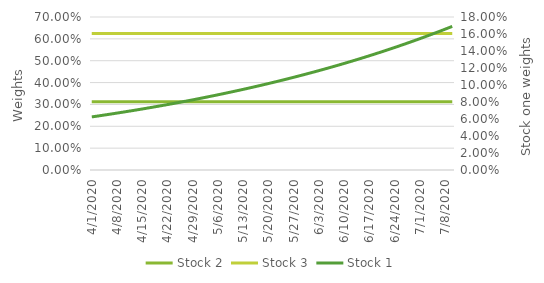
| Category | Stock 2 | Stock 3 |
|---|---|---|
| 4/1/20 | 0.312 | 0.625 |
| 4/2/20 | 0.312 | 0.625 |
| 4/3/20 | 0.312 | 0.625 |
| 4/4/20 | 0.312 | 0.625 |
| 4/5/20 | 0.312 | 0.625 |
| 4/6/20 | 0.312 | 0.625 |
| 4/7/20 | 0.312 | 0.625 |
| 4/8/20 | 0.312 | 0.625 |
| 4/9/20 | 0.312 | 0.625 |
| 4/10/20 | 0.312 | 0.625 |
| 4/11/20 | 0.312 | 0.625 |
| 4/12/20 | 0.312 | 0.625 |
| 4/13/20 | 0.312 | 0.625 |
| 4/14/20 | 0.312 | 0.625 |
| 4/15/20 | 0.312 | 0.625 |
| 4/16/20 | 0.312 | 0.625 |
| 4/17/20 | 0.312 | 0.625 |
| 4/18/20 | 0.312 | 0.625 |
| 4/19/20 | 0.312 | 0.625 |
| 4/20/20 | 0.312 | 0.625 |
| 4/21/20 | 0.312 | 0.625 |
| 4/22/20 | 0.312 | 0.625 |
| 4/23/20 | 0.312 | 0.625 |
| 4/24/20 | 0.312 | 0.625 |
| 4/25/20 | 0.312 | 0.625 |
| 4/26/20 | 0.312 | 0.625 |
| 4/27/20 | 0.312 | 0.625 |
| 4/28/20 | 0.312 | 0.625 |
| 4/29/20 | 0.312 | 0.625 |
| 4/30/20 | 0.312 | 0.625 |
| 5/1/20 | 0.312 | 0.625 |
| 5/2/20 | 0.312 | 0.625 |
| 5/3/20 | 0.312 | 0.625 |
| 5/4/20 | 0.312 | 0.625 |
| 5/5/20 | 0.312 | 0.625 |
| 5/6/20 | 0.312 | 0.625 |
| 5/7/20 | 0.312 | 0.625 |
| 5/8/20 | 0.312 | 0.625 |
| 5/9/20 | 0.312 | 0.625 |
| 5/10/20 | 0.312 | 0.625 |
| 5/11/20 | 0.312 | 0.625 |
| 5/12/20 | 0.312 | 0.625 |
| 5/13/20 | 0.312 | 0.625 |
| 5/14/20 | 0.312 | 0.625 |
| 5/15/20 | 0.312 | 0.625 |
| 5/16/20 | 0.312 | 0.625 |
| 5/17/20 | 0.312 | 0.625 |
| 5/18/20 | 0.312 | 0.625 |
| 5/19/20 | 0.312 | 0.625 |
| 5/20/20 | 0.312 | 0.625 |
| 5/21/20 | 0.312 | 0.625 |
| 5/22/20 | 0.312 | 0.625 |
| 5/23/20 | 0.312 | 0.625 |
| 5/24/20 | 0.312 | 0.625 |
| 5/25/20 | 0.312 | 0.625 |
| 5/26/20 | 0.312 | 0.625 |
| 5/27/20 | 0.312 | 0.625 |
| 5/28/20 | 0.312 | 0.625 |
| 5/29/20 | 0.312 | 0.625 |
| 5/30/20 | 0.312 | 0.625 |
| 5/31/20 | 0.312 | 0.625 |
| 6/1/20 | 0.312 | 0.625 |
| 6/2/20 | 0.312 | 0.625 |
| 6/3/20 | 0.312 | 0.625 |
| 6/4/20 | 0.312 | 0.625 |
| 6/5/20 | 0.312 | 0.625 |
| 6/6/20 | 0.312 | 0.625 |
| 6/7/20 | 0.312 | 0.625 |
| 6/8/20 | 0.312 | 0.625 |
| 6/9/20 | 0.312 | 0.625 |
| 6/10/20 | 0.312 | 0.625 |
| 6/11/20 | 0.312 | 0.625 |
| 6/12/20 | 0.312 | 0.625 |
| 6/13/20 | 0.312 | 0.625 |
| 6/14/20 | 0.312 | 0.625 |
| 6/15/20 | 0.312 | 0.625 |
| 6/16/20 | 0.312 | 0.625 |
| 6/17/20 | 0.312 | 0.625 |
| 6/18/20 | 0.312 | 0.625 |
| 6/19/20 | 0.312 | 0.625 |
| 6/20/20 | 0.312 | 0.625 |
| 6/21/20 | 0.312 | 0.625 |
| 6/22/20 | 0.312 | 0.625 |
| 6/23/20 | 0.312 | 0.625 |
| 6/24/20 | 0.312 | 0.625 |
| 6/25/20 | 0.312 | 0.625 |
| 6/26/20 | 0.312 | 0.625 |
| 6/27/20 | 0.312 | 0.625 |
| 6/28/20 | 0.312 | 0.625 |
| 6/29/20 | 0.312 | 0.625 |
| 6/30/20 | 0.312 | 0.625 |
| 7/1/20 | 0.312 | 0.625 |
| 7/2/20 | 0.312 | 0.625 |
| 7/3/20 | 0.312 | 0.625 |
| 7/4/20 | 0.312 | 0.625 |
| 7/5/20 | 0.312 | 0.625 |
| 7/6/20 | 0.312 | 0.625 |
| 7/7/20 | 0.312 | 0.625 |
| 7/8/20 | 0.312 | 0.625 |
| 7/9/20 | 0.312 | 0.625 |
| 7/10/20 | 0.312 | 0.625 |